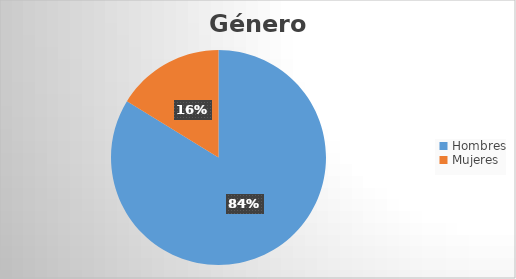
| Category | Series 0 |
|---|---|
| Hombres | 310 |
| Mujeres | 60 |